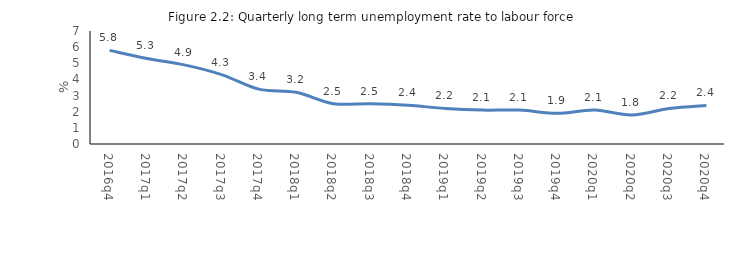
| Category | Series 0 |
|---|---|
| 2016q4 | 5.8 |
| 2017q1 | 5.3 |
| 2017q2 | 4.9 |
| 2017q3 | 4.3 |
| 2017q4 | 3.4 |
| 2018q1 | 3.2 |
| 2018q2 | 2.5 |
| 2018q3 | 2.5 |
| 2018q4 | 2.4 |
| 2019q1 | 2.2 |
| 2019q2 | 2.1 |
| 2019q3 | 2.1 |
| 2019q4 | 1.9 |
| 2020q1 | 2.1 |
| 2020q2 | 1.8 |
| 2020q3 | 2.2 |
| 2020q4 | 2.392 |